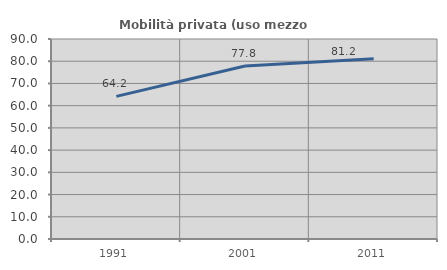
| Category | Mobilità privata (uso mezzo privato) |
|---|---|
| 1991.0 | 64.198 |
| 2001.0 | 77.825 |
| 2011.0 | 81.154 |